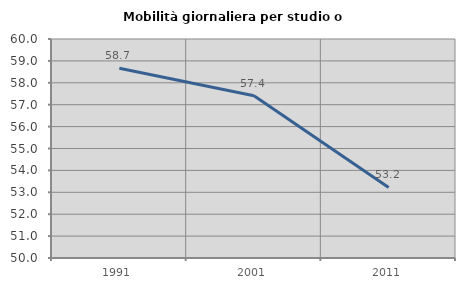
| Category | Mobilità giornaliera per studio o lavoro |
|---|---|
| 1991.0 | 58.662 |
| 2001.0 | 57.412 |
| 2011.0 | 53.222 |